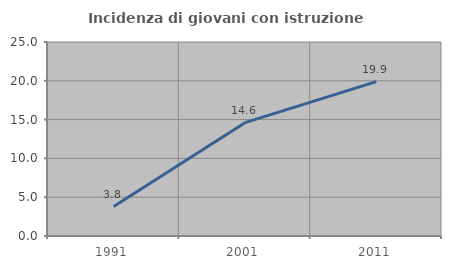
| Category | Incidenza di giovani con istruzione universitaria |
|---|---|
| 1991.0 | 3.797 |
| 2001.0 | 14.607 |
| 2011.0 | 19.898 |